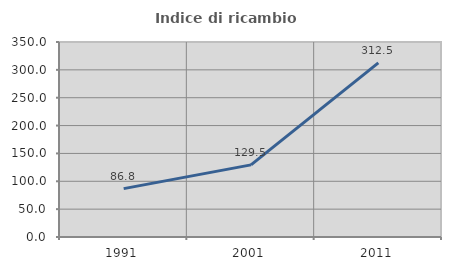
| Category | Indice di ricambio occupazionale  |
|---|---|
| 1991.0 | 86.789 |
| 2001.0 | 129.455 |
| 2011.0 | 312.5 |